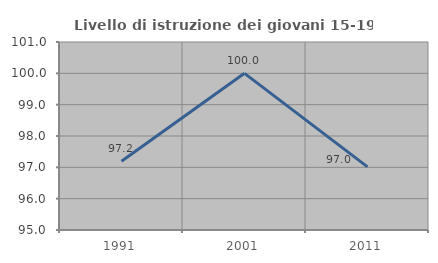
| Category | Livello di istruzione dei giovani 15-19 anni |
|---|---|
| 1991.0 | 97.196 |
| 2001.0 | 100 |
| 2011.0 | 97.015 |